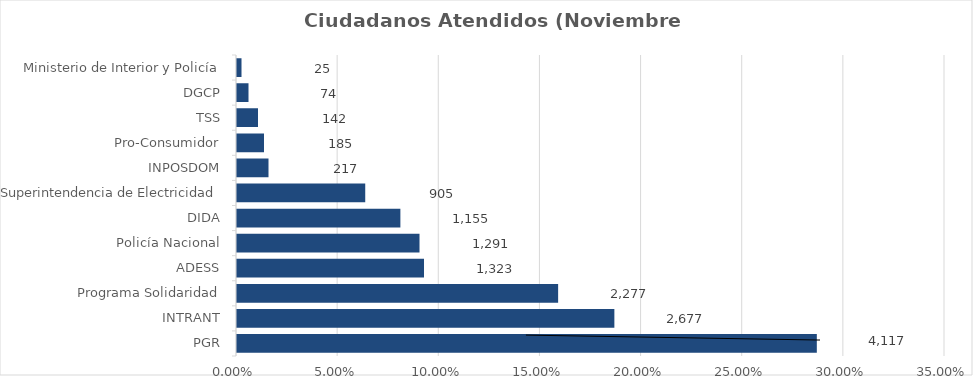
| Category | Porcentaje |
|---|---|
| PGR | 0.286 |
| INTRANT | 0.186 |
| Programa Solidaridad | 0.158 |
| ADESS | 0.092 |
| Policía Nacional | 0.09 |
| DIDA | 0.08 |
| Superintendencia de Electricidad | 0.063 |
| INPOSDOM | 0.015 |
| Pro-Consumidor | 0.013 |
| TSS | 0.01 |
| DGCP | 0.005 |
| Ministerio de Interior y Policía | 0.002 |